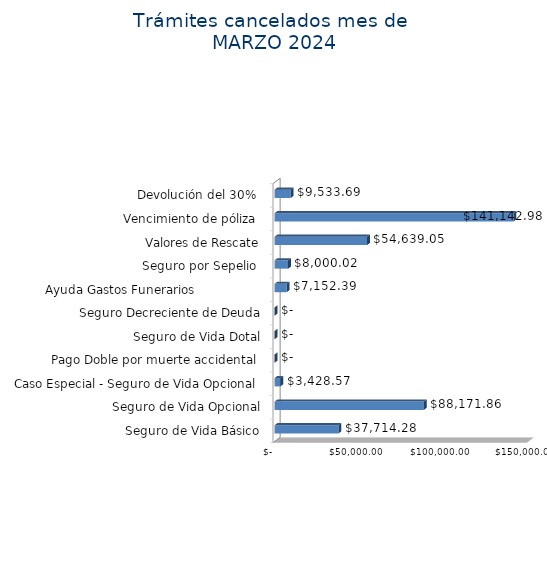
| Category | Monto  |
|---|---|
| Seguro de Vida Básico | 37714.28 |
| Seguro de Vida Opcional | 88171.86 |
| Caso Especial - Seguro de Vida Opcional  | 3428.57 |
| Pago Doble por muerte accidental  | 0 |
| Seguro de Vida Dotal | 0 |
| Seguro Decreciente de Deuda | 0 |
| Ayuda Gastos Funerarios                  | 7152.39 |
| Seguro por Sepelio  | 8000.02 |
| Valores de Rescate | 54639.05 |
| Vencimiento de póliza  | 141142.98 |
| Devolución del 30%  | 9533.69 |